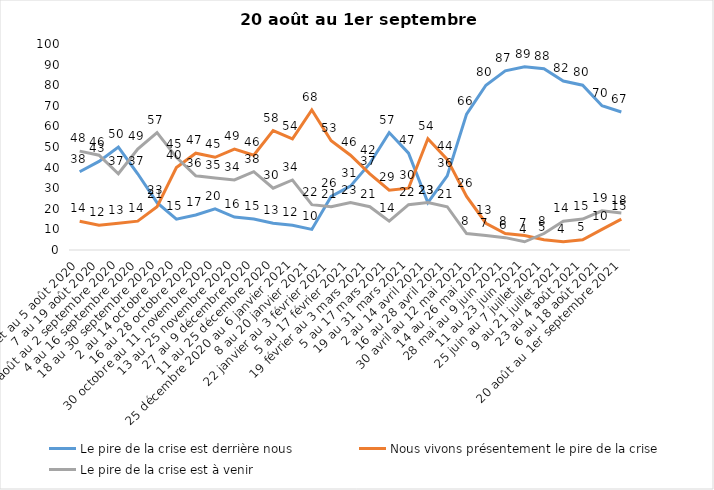
| Category | Le pire de la crise est derrière nous | Nous vivons présentement le pire de la crise | Le pire de la crise est à venir |
|---|---|---|---|
| 24 juillet au 5 août 2020 | 38 | 14 | 48 |
| 7 au 19 août 2020 | 43 | 12 | 46 |
| 21 août au 2 septembre 2020 | 50 | 13 | 37 |
| 4 au 16 septembre 2020 | 37 | 14 | 49 |
| 18 au 30 septembre 2020 | 23 | 21 | 57 |
| 2 au 14 octobre 2020 | 15 | 40 | 45 |
| 16 au 28 octobre 2020 | 17 | 47 | 36 |
| 30 octobre au 11 novembre 2020 | 20 | 45 | 35 |
| 13 au 25 novembre 2020 | 16 | 49 | 34 |
| 27 au 9 décembre 2020 | 15 | 46 | 38 |
| 11 au 25 décembre 2020 | 13 | 58 | 30 |
| 25 décembre 2020 au 6 janvier 2021 | 12 | 54 | 34 |
| 8 au 20 janvier 2021 | 10 | 68 | 22 |
| 22 janvier au 3 février 2021 | 26 | 53 | 21 |
| 5 au 17 février 2021 | 31 | 46 | 23 |
| 19 février au 3 mars 2021 | 42 | 37 | 21 |
| 5 au 17 mars 2021 | 57 | 29 | 14 |
| 19 au 31 mars 2021 | 47 | 30 | 22 |
| 2 au 14 avril 2021 | 23 | 54 | 23 |
| 16 au 28 avril 2021 | 36 | 44 | 21 |
| 30 avril au 12 mai 2021 | 66 | 26 | 8 |
| 14 au 26 mai 2021 | 80 | 13 | 7 |
| 28 mai au 9 juin 2021 | 87 | 8 | 6 |
| 11 au 23 juin 2021 | 89 | 7 | 4 |
| 25 juin au 7 juillet 2021 | 88 | 5 | 8 |
| 9 au 21 juillet 2021 | 82 | 4 | 14 |
| 23 au 4 août 2021 | 80 | 5 | 15 |
| 6 au 18 août 2021 | 70 | 10 | 19 |
| 20 août au 1er septembre 2021 | 67 | 15 | 18 |